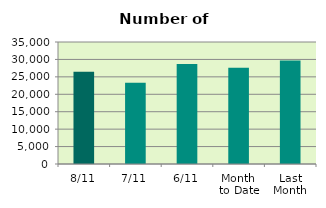
| Category | Series 0 |
|---|---|
| 8/11 | 26474 |
| 7/11 | 23326 |
| 6/11 | 28676 |
| Month 
to Date | 27616.333 |
| Last
Month | 29672.087 |